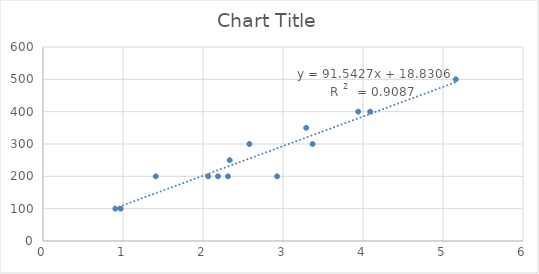
| Category | Series 0 |
|---|---|
| 3.28971962616819 | 350 |
| 2.186915887850683 | 200 |
| 2.3333333333334467 | 250 |
| 0.9708737864075738 | 100 |
| 2.064516129032317 | 200 |
| 0.9043478260870115 | 100 |
| 2.9262295081968905 | 200 |
| 2.3125000000000027 | 200 |
| 5.16 | 500 |
| 1.41 | 200 |
| 3.37 | 300 |
| 2.58 | 300 |
| 3.94 | 400 |
| 4.09 | 400 |